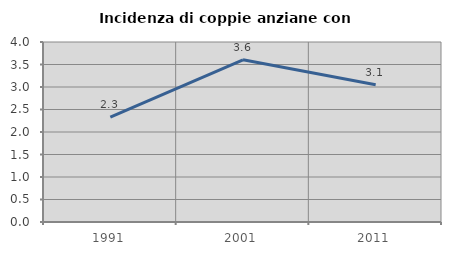
| Category | Incidenza di coppie anziane con figli |
|---|---|
| 1991.0 | 2.329 |
| 2001.0 | 3.604 |
| 2011.0 | 3.052 |